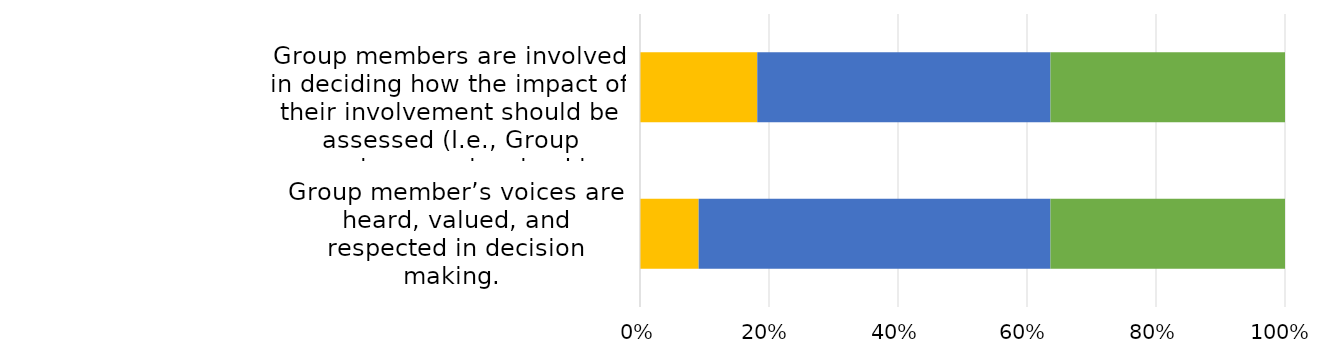
| Category | Strongly Disagree 
 | Disagree
 | Neither agree nor disagree
 | Agree
 | Strongly agree
 |
|---|---|---|---|---|---|
| Group member’s voices are heard, valued, and respected in decision making. 
 | 0 | 0 | 0.091 | 0.545 | 0.364 |
| 
Group members are involved in deciding how the impact of their involvement should be assessed (I.e., Group members are involved in deciding how to evaluate the progress and impact of the group). 
 | 0 | 0 | 0.182 | 0.455 | 0.364 |